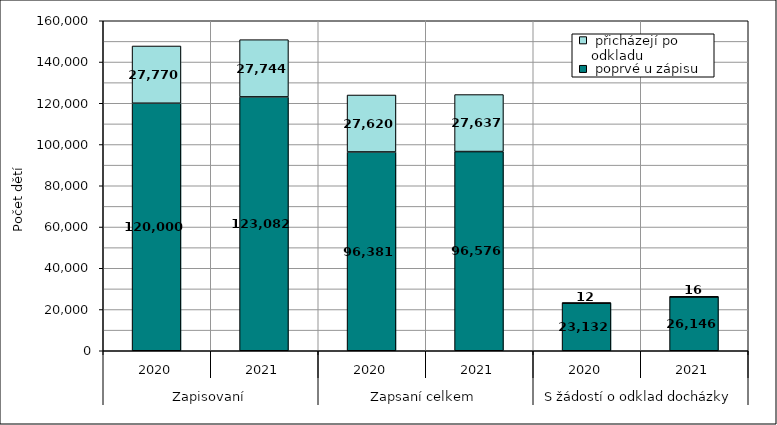
| Category |  poprvé u zápisu |  přicházejí po odkladu |
|---|---|---|
| 0 | 120000 | 27770 |
| 1 | 123082 | 27744 |
| 2 | 96381 | 27620 |
| 3 | 96576 | 27637 |
| 4 | 23132 | 12 |
| 5 | 26146 | 16 |